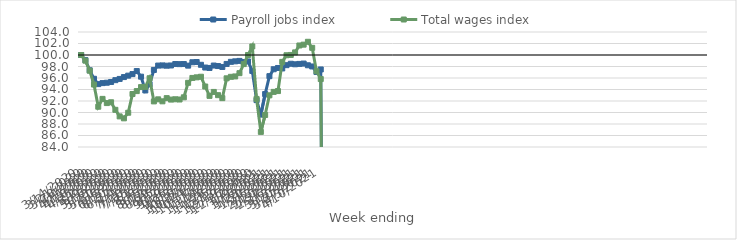
| Category | Payroll jobs index | Total wages index |
|---|---|---|
| 14/03/2020 | 100 | 100 |
| 21/03/2020 | 99.111 | 99.014 |
| 28/03/2020 | 97.344 | 97.271 |
| 04/04/2020 | 95.865 | 94.861 |
| 11/04/2020 | 94.936 | 91.008 |
| 18/04/2020 | 95.113 | 92.369 |
| 25/04/2020 | 95.178 | 91.636 |
| 02/05/2020 | 95.31 | 91.778 |
| 09/05/2020 | 95.624 | 90.462 |
| 16/05/2020 | 95.839 | 89.323 |
| 23/05/2020 | 96.161 | 88.985 |
| 30/05/2020 | 96.409 | 89.958 |
| 06/06/2020 | 96.681 | 93.216 |
| 13/06/2020 | 97.207 | 93.722 |
| 20/06/2020 | 96.231 | 94.418 |
| 27/06/2020 | 93.836 | 94.458 |
| 04/07/2020 | 94.916 | 95.96 |
| 11/07/2020 | 97.399 | 91.932 |
| 18/07/2020 | 98.163 | 92.289 |
| 25/07/2020 | 98.189 | 91.944 |
| 01/08/2020 | 98.139 | 92.499 |
| 08/08/2020 | 98.177 | 92.246 |
| 15/08/2020 | 98.43 | 92.3 |
| 22/08/2020 | 98.412 | 92.258 |
| 29/08/2020 | 98.428 | 92.641 |
| 05/09/2020 | 98.15 | 95.163 |
| 12/09/2020 | 98.74 | 96.013 |
| 19/09/2020 | 98.779 | 96.114 |
| 26/09/2020 | 98.299 | 96.219 |
| 03/10/2020 | 97.821 | 94.519 |
| 10/10/2020 | 97.75 | 92.893 |
| 17/10/2020 | 98.166 | 93.577 |
| 24/10/2020 | 98.08 | 93.015 |
| 31/10/2020 | 97.92 | 92.496 |
| 07/11/2020 | 98.445 | 95.944 |
| 14/11/2020 | 98.811 | 96.206 |
| 21/11/2020 | 98.898 | 96.273 |
| 28/11/2020 | 98.976 | 96.841 |
| 05/12/2020 | 98.776 | 98.418 |
| 12/12/2020 | 98.879 | 99.998 |
| 19/12/2020 | 97.228 | 101.485 |
| 26/12/2020 | 92.15 | 92.366 |
| 02/01/2021 | 89.631 | 86.626 |
| 09/01/2021 | 93.208 | 89.571 |
| 16/01/2021 | 96.322 | 92.992 |
| 23/01/2021 | 97.524 | 93.585 |
| 30/01/2021 | 97.744 | 93.728 |
| 06/02/2021 | 97.661 | 98.807 |
| 13/02/2021 | 98.231 | 99.958 |
| 20/02/2021 | 98.476 | 100.01 |
| 27/02/2021 | 98.384 | 100.453 |
| 06/03/2021 | 98.449 | 101.656 |
| 13/03/2021 | 98.513 | 101.801 |
| 20/03/2021 | 98.214 | 102.298 |
| 27/03/2021 | 98.007 | 101.247 |
| 03/04/2021 | 97.04 | 97.172 |
| 10/04/2021 | 97.485 | 95.817 |